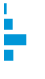
| Category | Series 0 |
|---|---|
| 0 | 0.042 |
| 1 | 0.197 |
| 2 | 0.546 |
| 3 | 0.214 |